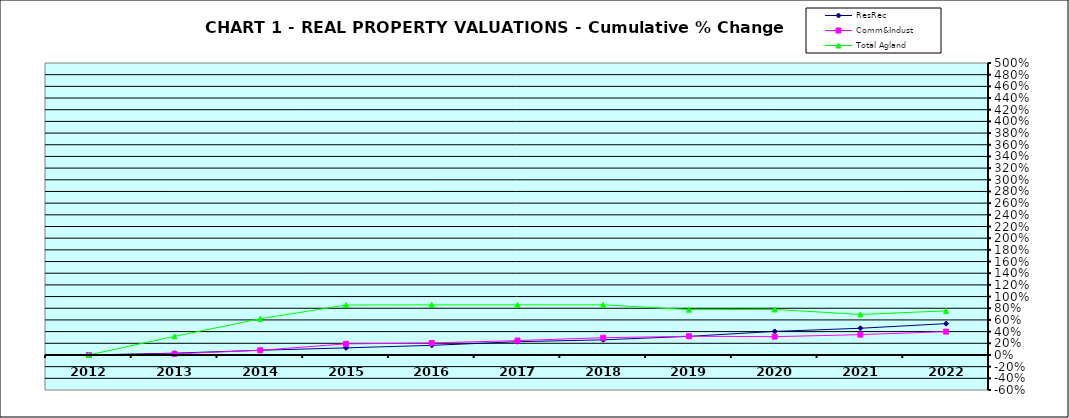
| Category | ResRec | Comm&Indust | Total Agland |
|---|---|---|---|
| 2012.0 | 0 | 0 | 0 |
| 2013.0 | 0.031 | 0.019 | 0.319 |
| 2014.0 | 0.081 | 0.08 | 0.62 |
| 2015.0 | 0.121 | 0.19 | 0.855 |
| 2016.0 | 0.165 | 0.206 | 0.858 |
| 2017.0 | 0.227 | 0.247 | 0.858 |
| 2018.0 | 0.259 | 0.296 | 0.859 |
| 2019.0 | 0.319 | 0.32 | 0.776 |
| 2020.0 | 0.403 | 0.313 | 0.78 |
| 2021.0 | 0.457 | 0.348 | 0.694 |
| 2022.0 | 0.537 | 0.4 | 0.756 |